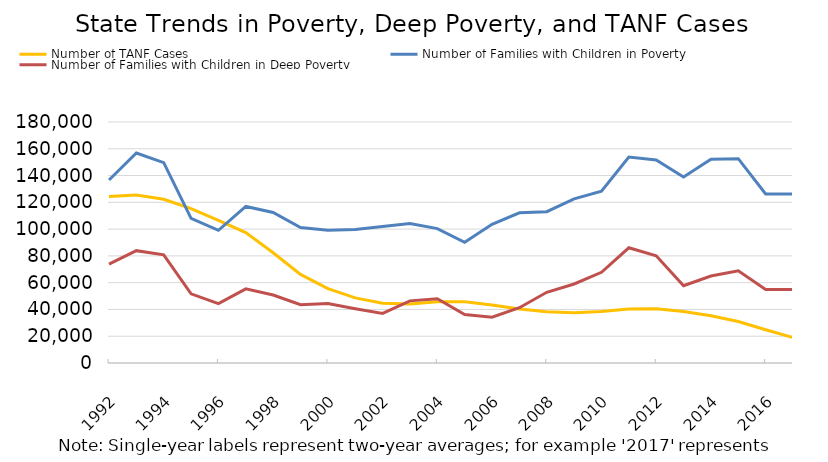
| Category | Number of TANF Cases | Number of Families with Children in Poverty | Number of Families with Children in Deep Poverty |
|---|---|---|---|
| 1992.0 | 124341.167 | 136675.5 | 73809.5 |
| 1993.0 | 125443.417 | 156831.5 | 83893.5 |
| 1994.0 | 122257.458 | 149603.5 | 80824.5 |
| 1995.0 | 115304.667 | 107995 | 51635.5 |
| 1996.0 | 106592.167 | 99101.5 | 44378.5 |
| 1997.0 | 97416 | 116943.5 | 55411.5 |
| 1998.0 | 82322.083 | 112410 | 50757 |
| 1999.0 | 66171.333 | 101223 | 43515.5 |
| 2000.0 | 55564.708 | 99092 | 44446.5 |
| 2001.0 | 48648.833 | 99780.5 | 40547.5 |
| 2002.0 | 44650.875 | 102007 | 37063 |
| 2003.0 | 44004.292 | 104254 | 46414 |
| 2004.0 | 45678.667 | 100382.5 | 47943.5 |
| 2005.0 | 45708.083 | 90144 | 36278 |
| 2006.0 | 43283.25 | 103634 | 34239.5 |
| 2007.0 | 40326.25 | 112156.5 | 41294.5 |
| 2008.0 | 38201.208 | 113035.5 | 52817.5 |
| 2009.0 | 37507.875 | 122616.5 | 59018.5 |
| 2010.0 | 38473.25 | 128350.5 | 67741.5 |
| 2011.0 | 40317.542 | 153772.5 | 86048 |
| 2012.0 | 40534.25 | 151568.5 | 80116.5 |
| 2013.0 | 38483.583 | 138979.5 | 57734.5 |
| 2014.0 | 35326.792 | 152233 | 64928.5 |
| 2015.0 | 30958.708 | 152622.5 | 68866 |
| 2016.0 | 24861 | 126255.5 | 54944.5 |
| 2017.0 | 18973.792 | 126255.5 | 54944.5 |